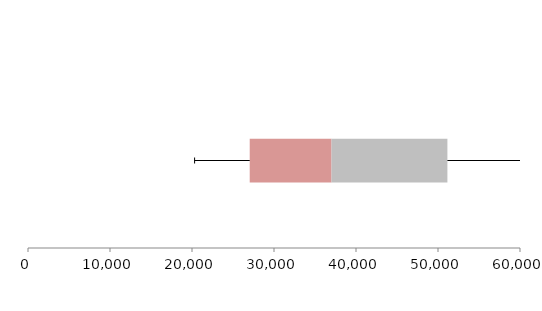
| Category | Series 1 | Series 2 | Series 3 |
|---|---|---|---|
| 0 | 27039.297 | 9976.826 | 14130.945 |